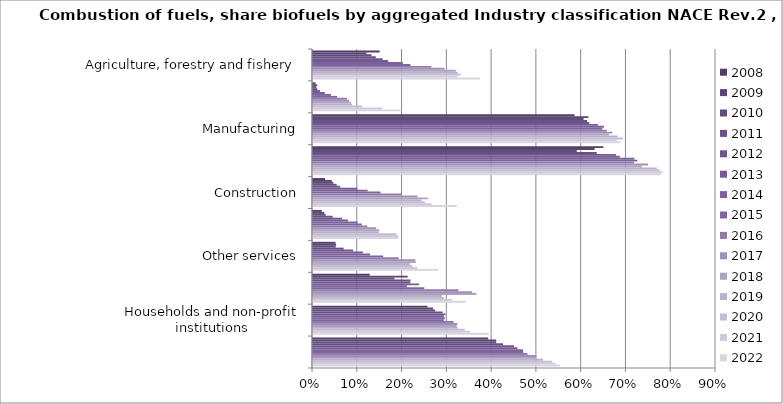
| Category | 2008 | 2009 | 2010 | 2011 | 2012 | 2013 | 2014 | 2015 | 2016 | 2017 | 2018 | 2019 | 2020 | 2021 | 2022 |
|---|---|---|---|---|---|---|---|---|---|---|---|---|---|---|---|
| Agriculture, forestry and fishery | 0.149 | 0.119 | 0.131 | 0.14 | 0.156 | 0.168 | 0.201 | 0.218 | 0.264 | 0.294 | 0.319 | 0.323 | 0.33 | 0.323 | 0.373 |
| Mining | 0.006 | 0.009 | 0.007 | 0.01 | 0.015 | 0.026 | 0.04 | 0.054 | 0.076 | 0.081 | 0.085 | 0.087 | 0.11 | 0.155 | 0.197 |
| Manufacturing | 0.584 | 0.615 | 0.604 | 0.612 | 0.617 | 0.636 | 0.65 | 0.646 | 0.656 | 0.669 | 0.661 | 0.68 | 0.692 | 0.678 | 0.686 |
| Electricity, gas and hot water supply, water distribution, 
waste water and waste management | 0.649 | 0.629 | 0.589 | 0.634 | 0.677 | 0.685 | 0.718 | 0.724 | 0.717 | 0.748 | 0.734 | 0.768 | 0.774 | 0.78 | 0.777 |
| Construction | 0.027 | 0.042 | 0.046 | 0.053 | 0.061 | 0.099 | 0.122 | 0.151 | 0.197 | 0.233 | 0.257 | 0.242 | 0.25 | 0.265 | 0.322 |
| Transport | 0.019 | 0.025 | 0.028 | 0.044 | 0.065 | 0.078 | 0.099 | 0.109 | 0.121 | 0.141 | 0.148 | 0.147 | 0.186 | 0.19 | 0.191 |
| Other services | 0.05 | 0.052 | 0.051 | 0.069 | 0.09 | 0.111 | 0.127 | 0.157 | 0.191 | 0.228 | 0.23 | 0.217 | 0.222 | 0.233 | 0.28 |
| Public sector | 0.127 | 0.211 | 0.182 | 0.218 | 0.217 | 0.237 | 0.21 | 0.249 | 0.325 | 0.356 | 0.365 | 0.288 | 0.293 | 0.311 | 0.341 |
| Households and non-profit institutions | 0.256 | 0.268 | 0.273 | 0.29 | 0.296 | 0.292 | 0.294 | 0.292 | 0.314 | 0.323 | 0.321 | 0.323 | 0.339 | 0.351 | 0.393 |
| Total | 0.391 | 0.409 | 0.409 | 0.424 | 0.449 | 0.457 | 0.469 | 0.47 | 0.479 | 0.499 | 0.499 | 0.513 | 0.534 | 0.542 | 0.551 |